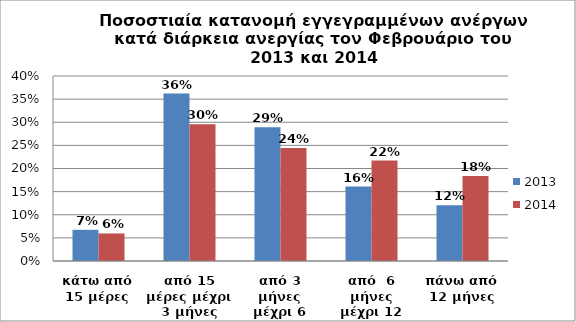
| Category | 2013 | 2014 |
|---|---|---|
| κάτω από 15 μέρες | 0.067 | 0.06 |
| από 15 μέρες μέχρι 3 μήνες | 0.362 | 0.295 |
| από 3 μήνες μέχρι 6 μήνες | 0.289 | 0.244 |
| από  6 μήνες μέχρι 12 μήνες | 0.161 | 0.217 |
| πάνω από 12 μήνες | 0.121 | 0.184 |